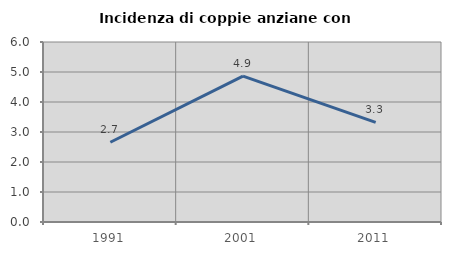
| Category | Incidenza di coppie anziane con figli |
|---|---|
| 1991.0 | 2.658 |
| 2001.0 | 4.863 |
| 2011.0 | 3.319 |